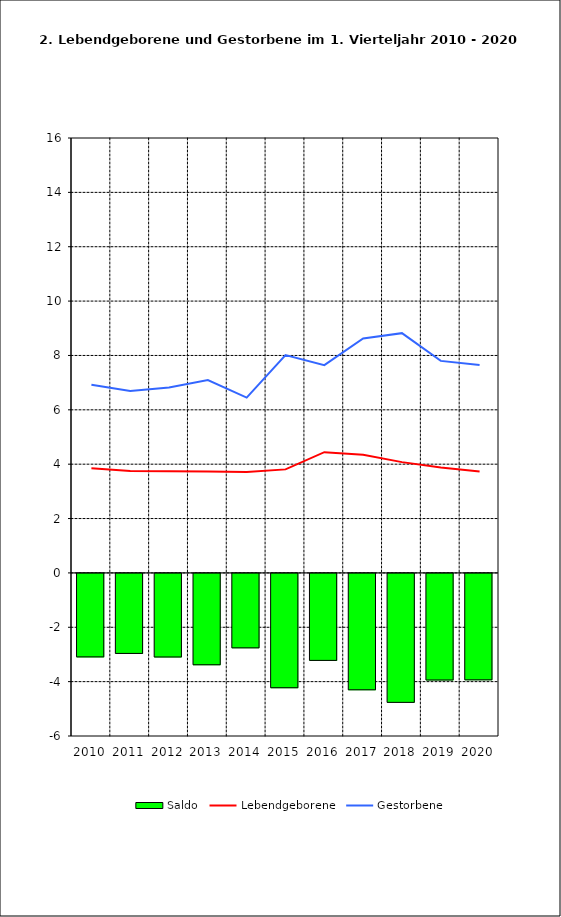
| Category | Saldo |
|---|---|
| 2010.0 | -3.071 |
| 2011.0 | -2.944 |
| 2012.0 | -3.075 |
| 2013.0 | -3.361 |
| 2014.0 | -2.739 |
| 2015.0 | -4.206 |
| 2016.0 | -3.2 |
| 2017.0 | -4.282 |
| 2018.0 | -4.744 |
| 2019.0 | -3.921 |
| 2020.0 | -3.916 |